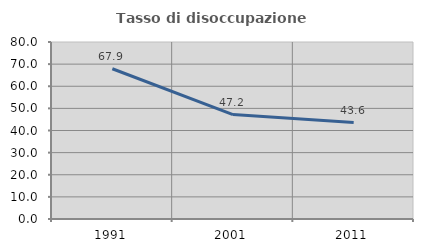
| Category | Tasso di disoccupazione giovanile  |
|---|---|
| 1991.0 | 67.9 |
| 2001.0 | 47.2 |
| 2011.0 | 43.564 |